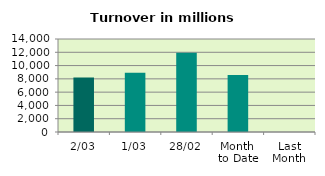
| Category | Series 0 |
|---|---|
| 2/03 | 8198.544 |
| 1/03 | 8930.586 |
| 28/02 | 11921.194 |
| Month 
to Date | 8564.565 |
| Last
Month | 0 |